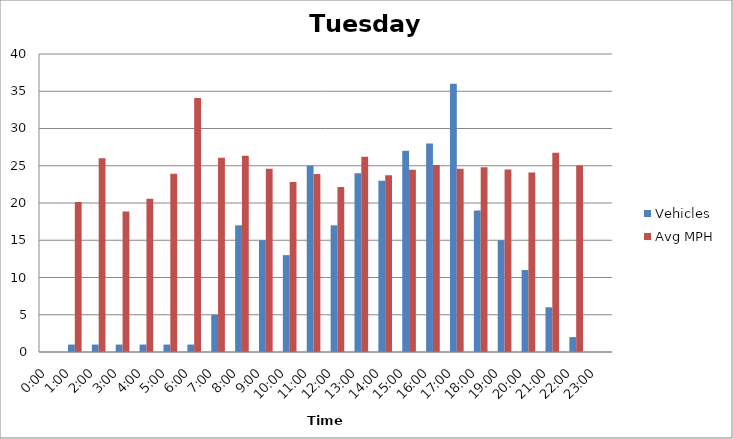
| Category | Vehicles | Avg MPH |
|---|---|---|
| 0:00 | 0 | 0 |
| 1:00 | 1 | 20.15 |
| 2:00 | 1 | 26.02 |
| 3:00 | 1 | 18.86 |
| 4:00 | 1 | 20.58 |
| 5:00 | 1 | 23.93 |
| 6:00 | 1 | 34.11 |
| 7:00 | 5 | 26.08 |
| 8:00 | 17 | 26.34 |
| 9:00 | 15 | 24.6 |
| 10:00 | 13 | 22.82 |
| 11:00 | 25 | 23.88 |
| 12:00 | 17 | 22.16 |
| 13:00 | 24 | 26.21 |
| 14:00 | 23 | 23.71 |
| 15:00 | 27 | 24.46 |
| 16:00 | 28 | 25.1 |
| 17:00 | 36 | 24.59 |
| 18:00 | 19 | 24.81 |
| 19:00 | 15 | 24.48 |
| 20:00 | 11 | 24.1 |
| 21:00 | 6 | 26.74 |
| 22:00 | 2 | 25.04 |
| 23:00 | 0 | 0 |